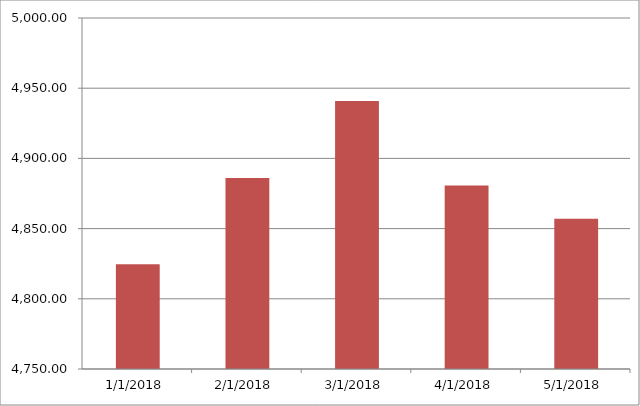
| Category | Series 0 | Series 1 |
|---|---|---|
| 1/1/18 |  | 4824.67 |
| 2/1/18 |  | 4886.02 |
| 3/1/18 |  | 4940.96 |
| 4/1/18 |  | 4880.65 |
| 5/1/18 |  | 4856.99 |